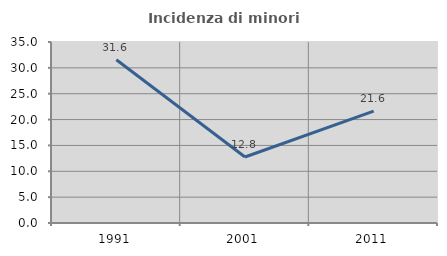
| Category | Incidenza di minori stranieri |
|---|---|
| 1991.0 | 31.579 |
| 2001.0 | 12.766 |
| 2011.0 | 21.622 |